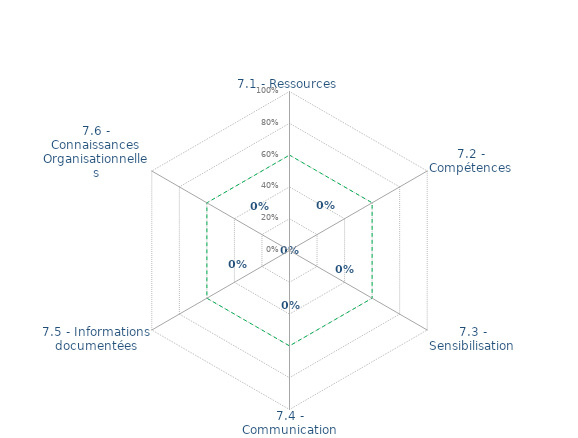
| Category | Art. 7 | limite de CONFORMITÉ |
|---|---|---|
| 7.1 - Ressources | 0 | 0.6 |
| 7.2 - Compétences | 0 | 0.6 |
| 7.3 - Sensibilisation | 0 | 0.6 |
| 7.4 - Communication | 0 | 0.6 |
| 7.5 - Informations documentées | 0 | 0.6 |
| 7.6 - Connaissances Organisationnelles | 0 | 0.6 |